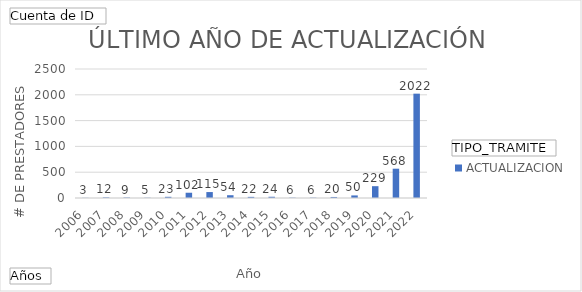
| Category | ACTUALIZACION |
|---|---|
| 2006 | 3 |
| 2007 | 12 |
| 2008 | 9 |
| 2009 | 5 |
| 2010 | 23 |
| 2011 | 102 |
| 2012 | 115 |
| 2013 | 54 |
| 2014 | 22 |
| 2015 | 24 |
| 2016 | 6 |
| 2017 | 6 |
| 2018 | 20 |
| 2019 | 50 |
| 2020 | 229 |
| 2021 | 568 |
| 2022 | 2022 |